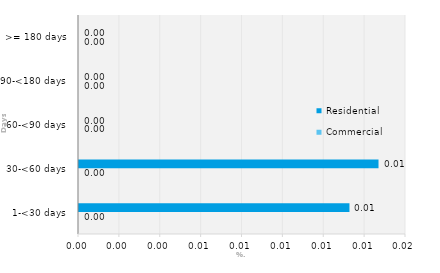
| Category | Commercial | Residential |
|---|---|---|
| 1-<30 days | 0 | 0.013 |
| 30-<60 days | 0 | 0.015 |
| 60-<90 days | 0 | 0 |
| 90-<180 days | 0 | 0 |
| >= 180 days | 0 | 0 |